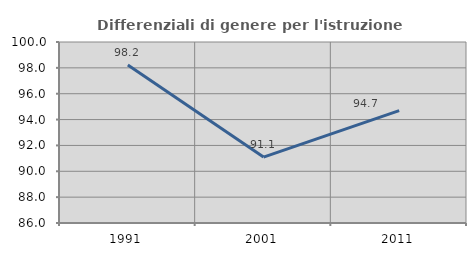
| Category | Differenziali di genere per l'istruzione superiore |
|---|---|
| 1991.0 | 98.226 |
| 2001.0 | 91.1 |
| 2011.0 | 94.688 |